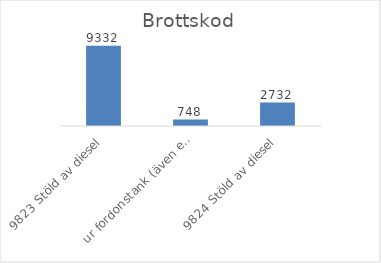
| Category | Summa |
|---|---|
| 9823 Stöld av diesel, ur fordonstank (även entreprenadmaskin m.m.) | 9332 |
| 9824 Stöld av diesel, ur större tankar (ej kopplade till fordon) | 748 |
| 9825 Stöld av drivmedel (även diesel), ej genom smitning | 2732 |